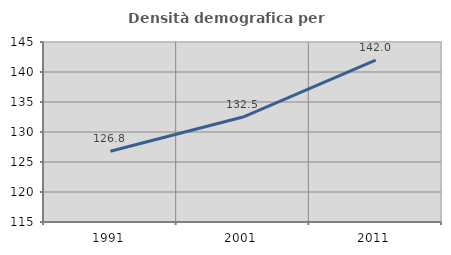
| Category | Densità demografica |
|---|---|
| 1991.0 | 126.789 |
| 2001.0 | 132.488 |
| 2011.0 | 141.989 |